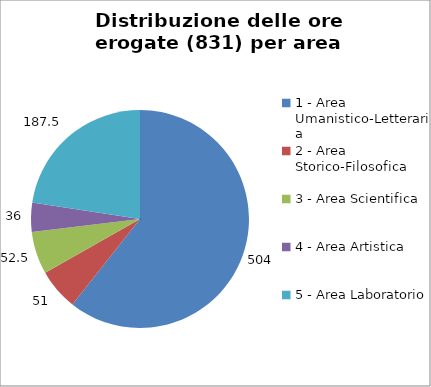
| Category | Nr. Ore Erogate |
|---|---|
| 1 - Area Umanistico-Letteraria | 504 |
| 2 - Area Storico-Filosofica | 51 |
| 3 - Area Scientifica | 52.5 |
| 4 - Area Artistica | 36 |
| 5 - Area Laboratorio | 187.5 |